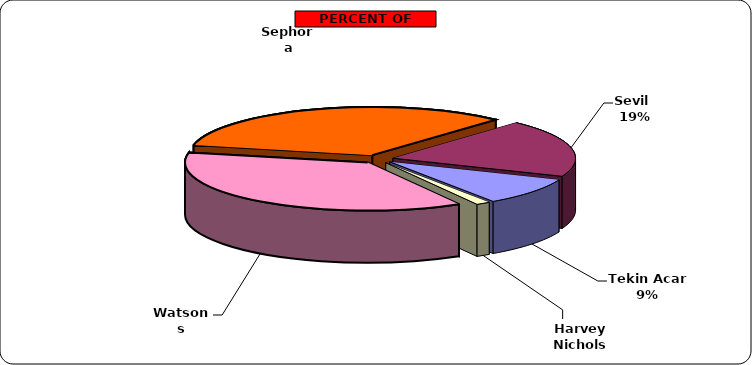
| Category | Series 0 |
|---|---|
| Watsons | 5940 |
| Sephora | 5423 |
| Sevil  | 3130 |
| Tekin Acar  | 1503 |
| Harvey Nichols | 202 |